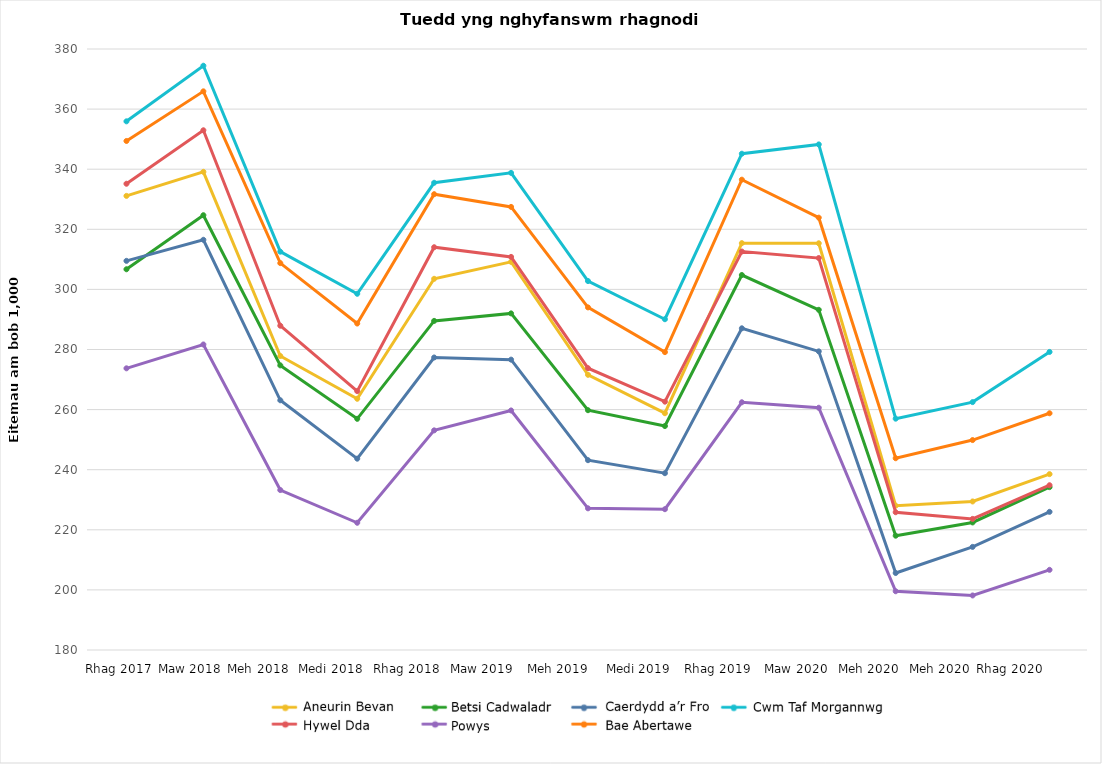
| Category | Aneurin Bevan | Betsi Cadwaladr | Cardiff And Vale | Cwm Taf Morgannwg | Hywel Dda | Powys | Swansea Bay |
|---|---|---|---|---|---|---|---|
| Dec 2017 | 331.116 | 306.698 | 309.498 | 355.93 | 335.159 | 273.739 | 349.394 |
| Mar 2018 | 339.123 | 324.686 | 316.508 | 374.433 | 352.953 | 281.673 | 365.912 |
| Jun 2018 | 277.838 | 274.717 | 263.102 | 312.551 | 287.914 | 233.229 | 308.747 |
| Sep 2018 | 263.599 | 256.93 | 243.666 | 298.542 | 266.14 | 222.339 | 288.641 |
| Dec 2018 | 303.525 | 289.516 | 277.34 | 335.482 | 314.031 | 253.091 | 331.686 |
| Mar 2019 | 309.163 | 292.017 | 276.629 | 338.774 | 310.816 | 259.715 | 327.453 |
| Jun 2019 | 271.579 | 259.799 | 243.164 | 302.781 | 273.784 | 227.145 | 294.008 |
| Sep 2019 | 258.797 | 254.528 | 238.835 | 290.075 | 262.635 | 226.856 | 279.128 |
| Dec 2019 | 315.391 | 304.789 | 287.051 | 345.151 | 312.603 | 262.439 | 336.514 |
| Mar 2020 | 315.35 | 293.203 | 279.375 | 348.247 | 310.432 | 260.613 | 323.87 |
| Jun 2020 | 228.026 | 218.04 | 205.624 | 256.981 | 225.848 | 199.551 | 243.815 |
| Sep 2020 | 229.426 | 222.449 | 214.314 | 262.494 | 223.623 | 198.149 | 249.861 |
| Dec 2020 | 238.523 | 234.198 | 225.975 | 279.192 | 234.831 | 206.678 | 258.779 |